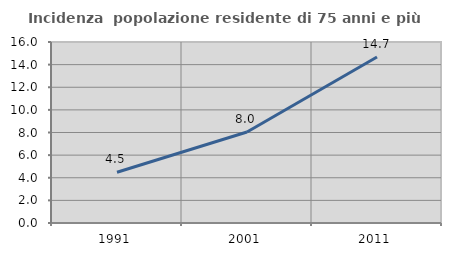
| Category | Incidenza  popolazione residente di 75 anni e più |
|---|---|
| 1991.0 | 4.487 |
| 2001.0 | 8.042 |
| 2011.0 | 14.677 |